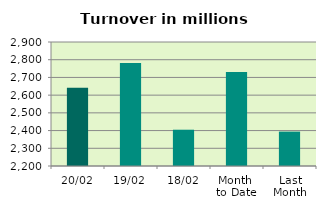
| Category | Series 0 |
|---|---|
| 20/02 | 2641.545 |
| 19/02 | 2781.186 |
| 18/02 | 2404.86 |
| Month 
to Date | 2731.1 |
| Last
Month | 2394.171 |